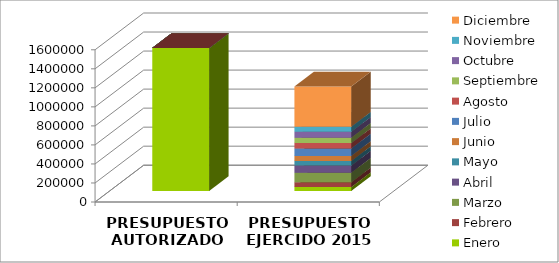
| Category | Enero  | Febrero | Marzo | Abril | Mayo | Junio | Julio | Agosto | Septiembre | Octubre | Noviembre | Diciembre |
|---|---|---|---|---|---|---|---|---|---|---|---|---|
| PRESUPUESTO AUTORIZADO 2015 | 1502304.72 | 0 | 0 | 0 | 0 | 0 | 0 | 0 | 0 | 0 | 0 | 0 |
| PRESUPUESTO EJERCIDO 2015 | 41220.111 | 50107.549 | 100814.25 | 74982.46 | 47885.26 | 53529.91 | 78907.75 | 55971.73 | 56280.42 | 63171.63 | 52837.7 | 422216.25 |